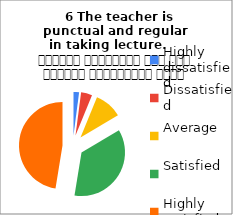
| Category |    6 The teacher is 
punctual and regular  in taking lecture.     शिक्षक समयनिष्ठ हैं एवं नियमित व्याख्यान देते हैं |
|---|---|
| Highly dissatisfied | 2 |
| Dissatisfied | 4 |
| Average | 10 |
| Satisfied | 35 |
| Highly satisfied | 46 |